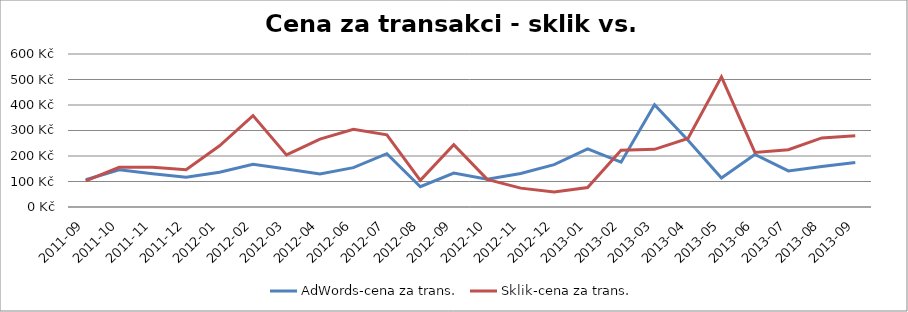
| Category | AdWords-cena za trans. | Sklik-cena za trans. |
|---|---|---|
| 2011-09 | 106.897 | 102.028 |
| 2011-10 | 145.762 | 155.83 |
| 2011-11 | 130.065 | 155.707 |
| 2011-12 | 116.96 | 146.345 |
| 2012-01 | 136.311 | 239.826 |
| 2012-02 | 167.899 | 358.299 |
| 2012-03 | 148.777 | 204.239 |
| 2012-04 | 129.528 | 266.259 |
| 2012-06 | 154.426 | 305.131 |
| 2012-07 | 209.215 | 283.155 |
| 2012-08 | 79.457 | 104.516 |
| 2012-09 | 133.21 | 244.348 |
| 2012-10 | 108.967 | 108.227 |
| 2012-11 | 131.481 | 74.023 |
| 2012-12 | 166.237 | 59.345 |
| 2013-01 | 228.199 | 76.504 |
| 2013-02 | 175.802 | 222.487 |
| 2013-03 | 400.972 | 226.227 |
| 2013-04 | 261.846 | 268.674 |
| 2013-05 | 113.747 | 510.315 |
| 2013-06 | 205.857 | 213.879 |
| 2013-07 | 141.515 | 224.517 |
| 2013-08 | 158.382 | 270.769 |
| 2013-09 | 174.843 | 279.049 |